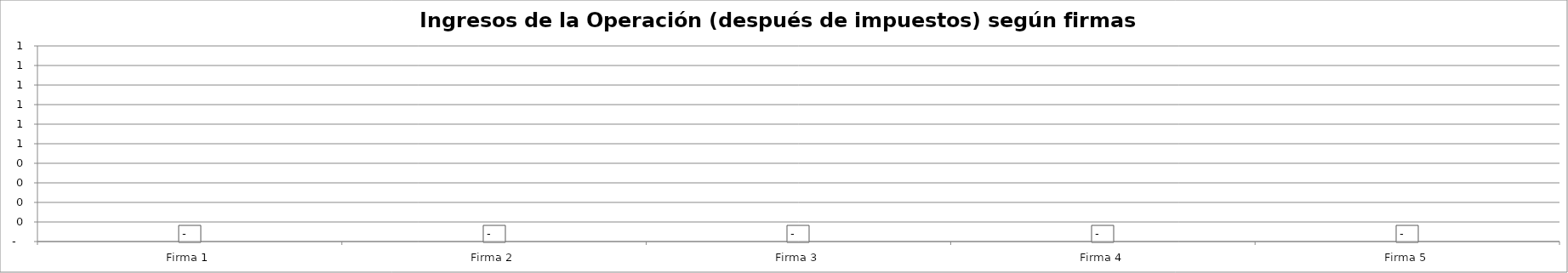
| Category | Ingresos de la Operación (después de impuestos) según firmas simuladas - Año 9 |
|---|---|
| Firma 1 | 0 |
| Firma 2 | 0 |
| Firma 3 | 0 |
| Firma 4 | 0 |
| Firma 5 | 0 |